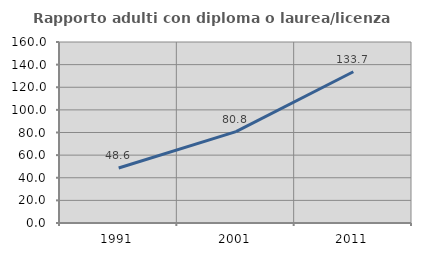
| Category | Rapporto adulti con diploma o laurea/licenza media  |
|---|---|
| 1991.0 | 48.571 |
| 2001.0 | 80.808 |
| 2011.0 | 133.686 |